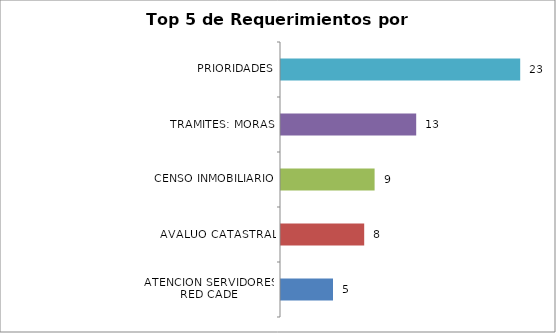
| Category | Total |
|---|---|
| ATENCION SERVIDORES RED CADE | 5 |
| AVALUO CATASTRAL | 8 |
| CENSO INMOBILIARIO | 9 |
| TRAMITES: MORAS, PRIORIDADES | 13 |
| ATENCION Y SERVICIO A LA CIUDADANIA | 23 |